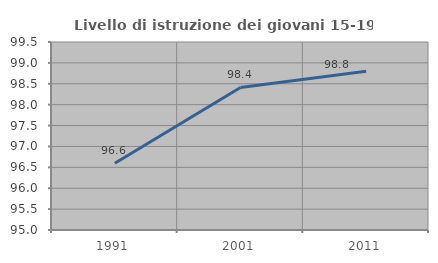
| Category | Livello di istruzione dei giovani 15-19 anni |
|---|---|
| 1991.0 | 96.599 |
| 2001.0 | 98.413 |
| 2011.0 | 98.798 |